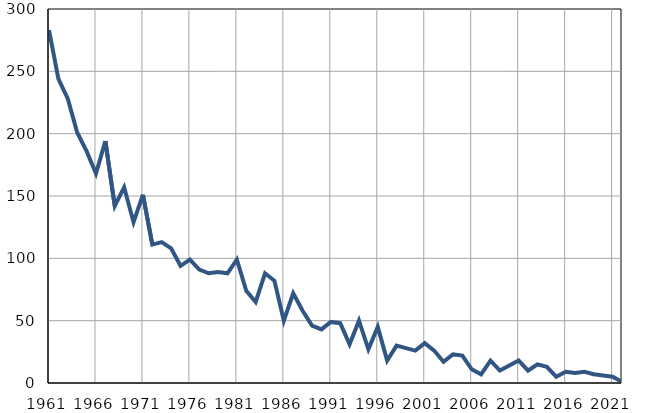
| Category | Умрла 
одојчад |
|---|---|
| 1961.0 | 283 |
| 1962.0 | 244 |
| 1963.0 | 228 |
| 1964.0 | 201 |
| 1965.0 | 186 |
| 1966.0 | 168 |
| 1967.0 | 194 |
| 1968.0 | 142 |
| 1969.0 | 157 |
| 1970.0 | 129 |
| 1971.0 | 151 |
| 1972.0 | 111 |
| 1973.0 | 113 |
| 1974.0 | 108 |
| 1975.0 | 94 |
| 1976.0 | 99 |
| 1977.0 | 91 |
| 1978.0 | 88 |
| 1979.0 | 89 |
| 1980.0 | 88 |
| 1981.0 | 99 |
| 1982.0 | 74 |
| 1983.0 | 65 |
| 1984.0 | 88 |
| 1985.0 | 82 |
| 1986.0 | 50 |
| 1987.0 | 72 |
| 1988.0 | 58 |
| 1989.0 | 46 |
| 1990.0 | 43 |
| 1991.0 | 49 |
| 1992.0 | 48 |
| 1993.0 | 31 |
| 1994.0 | 50 |
| 1995.0 | 27 |
| 1996.0 | 45 |
| 1997.0 | 18 |
| 1998.0 | 30 |
| 1999.0 | 28 |
| 2000.0 | 26 |
| 2001.0 | 32 |
| 2002.0 | 26 |
| 2003.0 | 17 |
| 2004.0 | 23 |
| 2005.0 | 22 |
| 2006.0 | 11 |
| 2007.0 | 7 |
| 2008.0 | 18 |
| 2009.0 | 10 |
| 2010.0 | 14 |
| 2011.0 | 18 |
| 2012.0 | 10 |
| 2013.0 | 15 |
| 2014.0 | 13 |
| 2015.0 | 5 |
| 2016.0 | 9 |
| 2017.0 | 8 |
| 2018.0 | 9 |
| 2019.0 | 7 |
| 2020.0 | 6 |
| 2021.0 | 5 |
| 2022.0 | 1 |